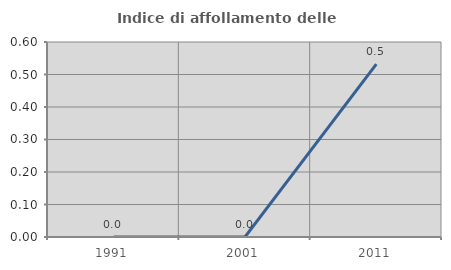
| Category | Indice di affollamento delle abitazioni  |
|---|---|
| 1991.0 | 0 |
| 2001.0 | 0 |
| 2011.0 | 0.532 |